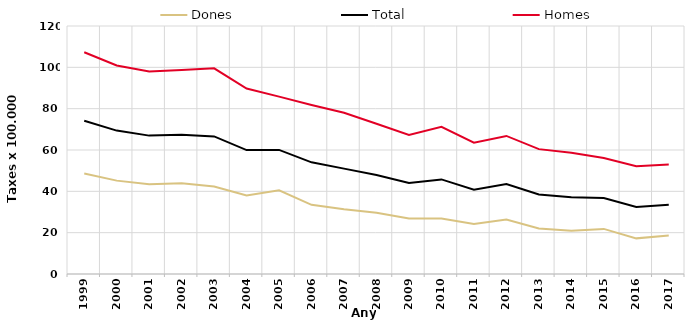
| Category | Dones | Total | Homes |
|---|---|---|---|
| 1999.0 | 48.67 | 74.18 | 107.32 |
| 2000.0 | 45.18 | 69.39 | 100.88 |
| 2001.0 | 43.48 | 66.96 | 97.96 |
| 2002.0 | 43.88 | 67.42 | 98.72 |
| 2003.0 | 42.35 | 66.58 | 99.5 |
| 2004.0 | 38 | 59.95 | 89.73 |
| 2005.0 | 40.54 | 60.05 | 85.84 |
| 2006.0 | 33.48 | 54.03 | 81.79 |
| 2007.0 | 31.38 | 50.98 | 78.01 |
| 2008.0 | 29.68 | 47.9 | 72.73 |
| 2009.0 | 26.88 | 44.06 | 67.31 |
| 2010.0 | 26.83 | 45.77 | 71.26 |
| 2011.0 | 24.2 | 40.76 | 63.53 |
| 2012.0 | 26.32 | 43.54 | 66.81 |
| 2013.0 | 22.04 | 38.48 | 60.42 |
| 2014.0 | 20.89 | 37.12 | 58.63 |
| 2015.0 | 21.82 | 36.81 | 56.09 |
| 2016.0 | 17.24 | 32.41 | 52.17 |
| 2017.0 | 18.61 | 33.52 | 52.98 |